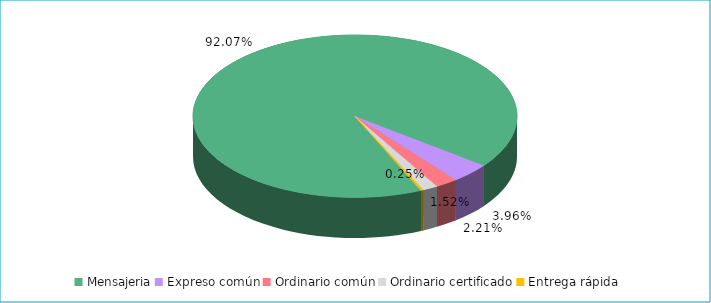
| Category | Series 0 |
|---|---|
| Mensajeria | 0.921 |
| Expreso común | 0.04 |
| Ordinario común | 0.022 |
| Ordinario certificado | 0.015 |
| Entrega rápida | 0.002 |